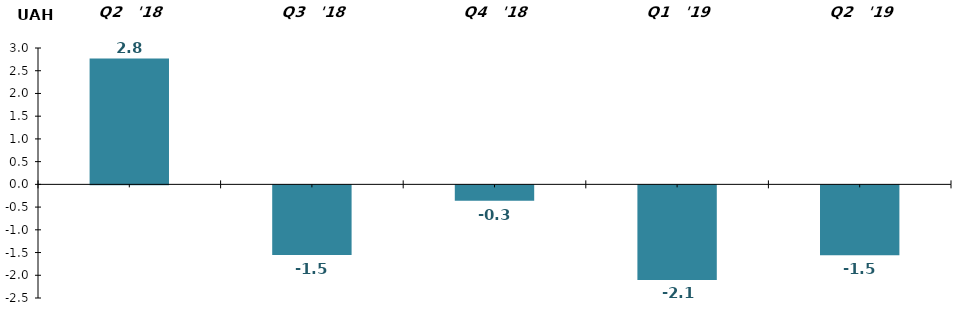
| Category | UAH M |
|---|---|
| Q2   '18 | 2.77 |
| Q3   '18 | -1.532 |
| Q4   '18 | -0.341 |
| Q1   '19 | -2.084 |
| Q2   '19 | -1.537 |